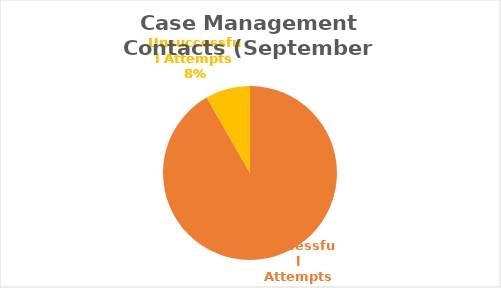
| Category | Series 0 |
|---|---|
| Successful Attempts | 210 |
| Unsuccessful Attempts | 19 |